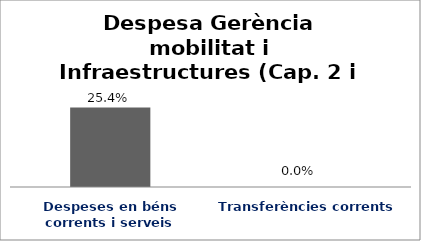
| Category | Series 0 |
|---|---|
| Despeses en béns corrents i serveis | 0.254 |
| Transferències corrents | 0 |